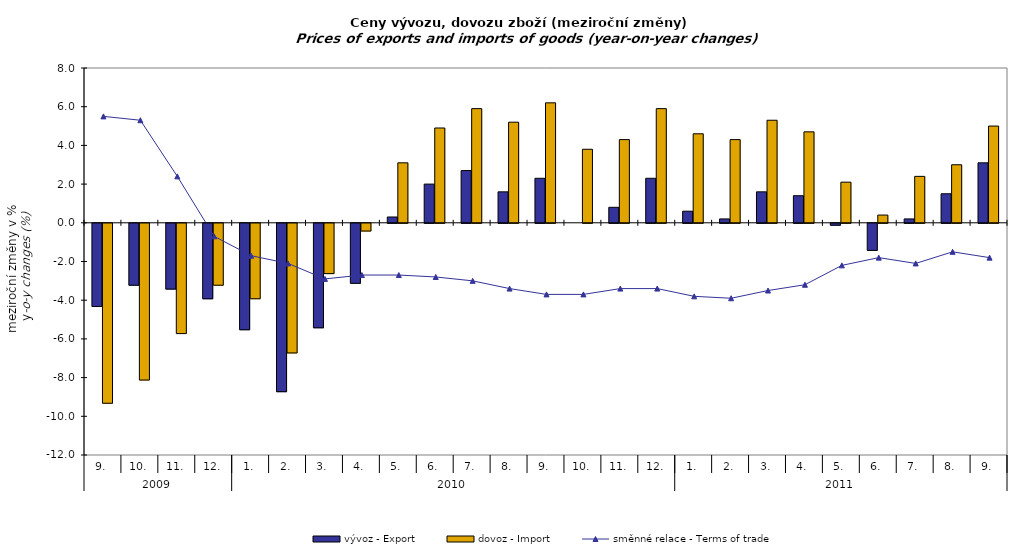
| Category | vývoz - Export | dovoz - Import |
|---|---|---|
| 0 | -4.3 | -9.3 |
| 1 | -3.2 | -8.1 |
| 2 | -3.4 | -5.7 |
| 3 | -3.9 | -3.2 |
| 4 | -5.5 | -3.9 |
| 5 | -8.7 | -6.7 |
| 6 | -5.4 | -2.6 |
| 7 | -3.1 | -0.4 |
| 8 | 0.3 | 3.1 |
| 9 | 2 | 4.9 |
| 10 | 2.7 | 5.9 |
| 11 | 1.6 | 5.2 |
| 12 | 2.3 | 6.2 |
| 13 | 0 | 3.8 |
| 14 | 0.8 | 4.3 |
| 15 | 2.3 | 5.9 |
| 16 | 0.6 | 4.6 |
| 17 | 0.2 | 4.3 |
| 18 | 1.6 | 5.3 |
| 19 | 1.4 | 4.7 |
| 20 | -0.1 | 2.1 |
| 21 | -1.4 | 0.4 |
| 22 | 0.2 | 2.4 |
| 23 | 1.5 | 3 |
| 24 | 3.1 | 5 |